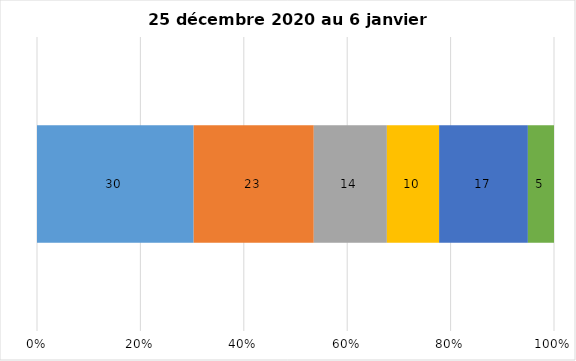
| Category | Plusieurs fois par jour | Une fois par jour | Quelques fois par semaine   | Une fois par semaine ou moins   |  Jamais   |  Je n’utilise pas les médias sociaux |
|---|---|---|---|---|---|---|
| 0 | 30 | 23 | 14 | 10 | 17 | 5 |